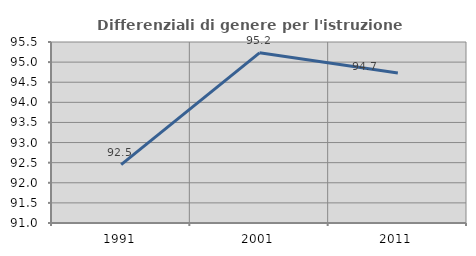
| Category | Differenziali di genere per l'istruzione superiore |
|---|---|
| 1991.0 | 92.452 |
| 2001.0 | 95.23 |
| 2011.0 | 94.727 |